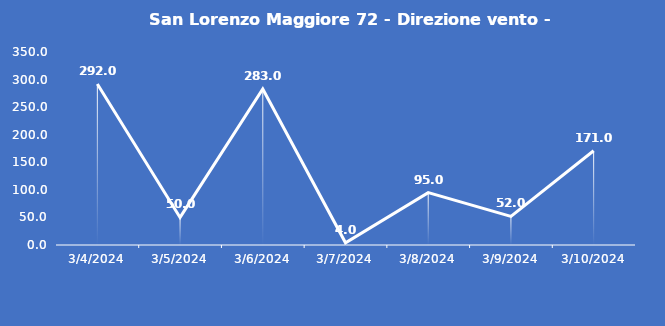
| Category | San Lorenzo Maggiore 72 - Direzione vento - Grezzo (°N) |
|---|---|
| 3/4/24 | 292 |
| 3/5/24 | 50 |
| 3/6/24 | 283 |
| 3/7/24 | 4 |
| 3/8/24 | 95 |
| 3/9/24 | 52 |
| 3/10/24 | 171 |